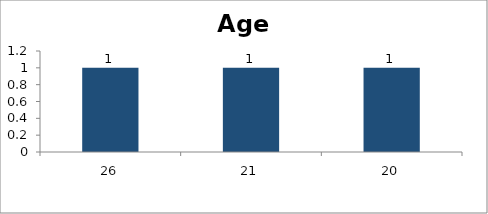
| Category | Age |
|---|---|
| 26.0 | 1 |
| 21.0 | 1 |
| 20.0 | 1 |